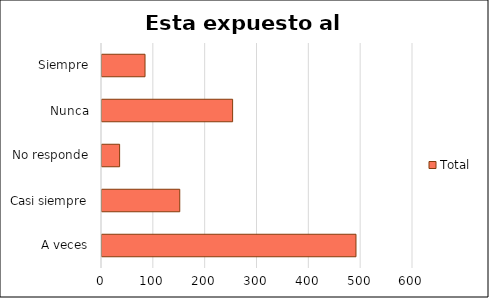
| Category | Total |
|---|---|
| A veces | 490 |
| Casi siempre | 150 |
| No responde | 34 |
| Nunca | 252 |
| Siempre | 83 |